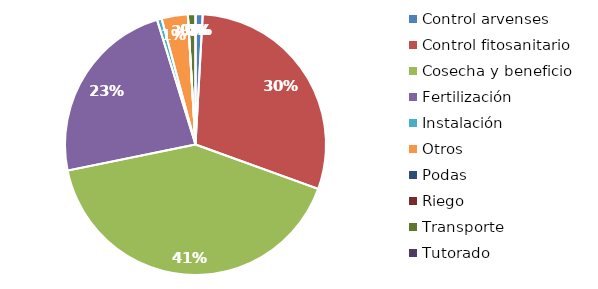
| Category | Valor |
|---|---|
| Control arvenses | 759280 |
| Control fitosanitario | 25416085 |
| Cosecha y beneficio | 35388477.163 |
| Fertilización | 20107114 |
| Instalación | 493200 |
| Otros | 2782800 |
| Podas | 0 |
| Riego | 0 |
| Transporte | 806850 |
| Tutorado | 0 |